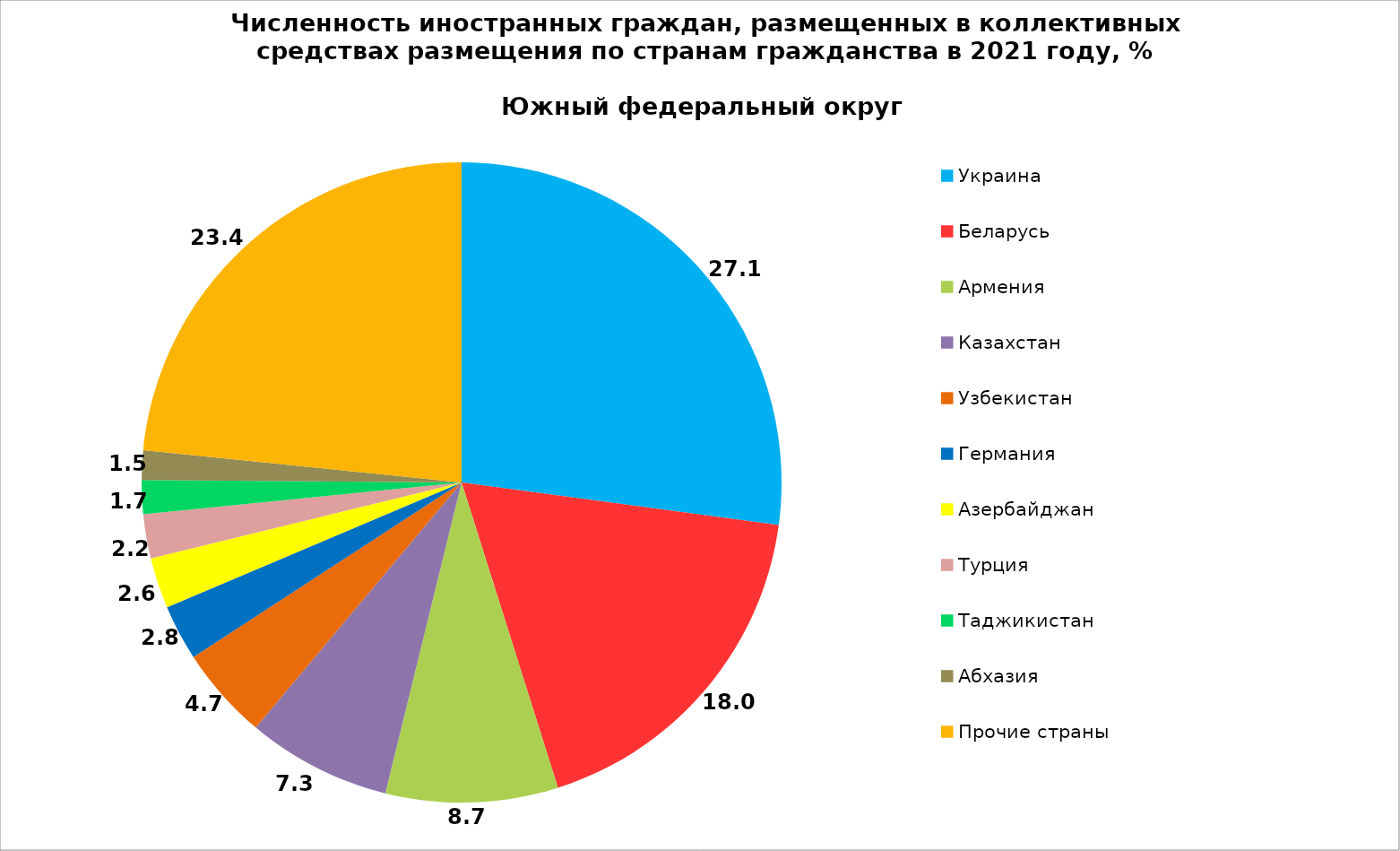
| Category | Series 0 |
|---|---|
| Украина | 27.126 |
| Беларусь | 18.003 |
| Армения | 8.704 |
| Казахстан | 7.286 |
| Узбекистан | 4.698 |
| Германия | 2.806 |
| Азербайджан | 2.557 |
| Турция | 2.231 |
| Таджикистан | 1.714 |
| Абхазия | 1.486 |
| Прочие страны | 23.388 |